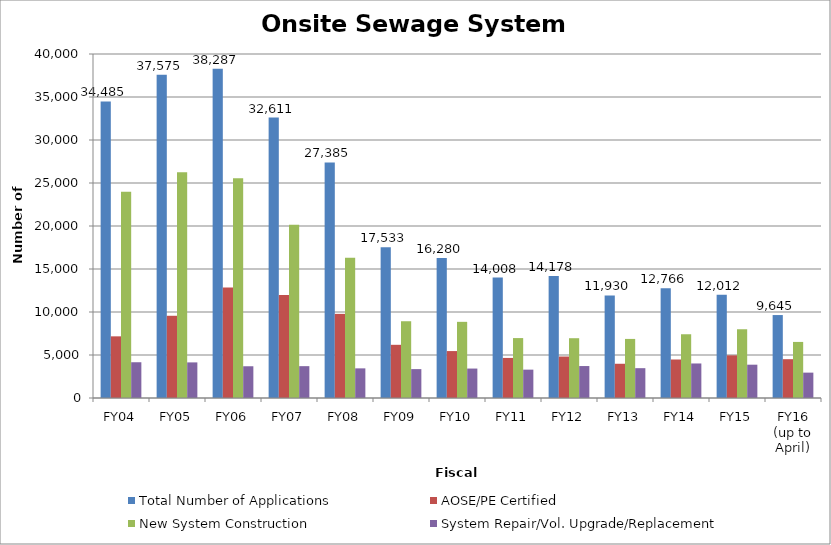
| Category | Total Number of Applications | AOSE/PE Certified | New System Construction | System Repair/Vol. Upgrade/Replacement |
|---|---|---|---|---|
| FY04 | 34485 | 7170 | 23980 | 4158 |
| FY05 | 37575 | 9561 | 26264 | 4140 |
| FY06 | 38287 | 12838 | 25538 | 3691 |
| FY07 | 32611 | 11972 | 20151 | 3703 |
| FY08 | 27385 | 9781 | 16308 | 3446 |
| FY09 | 17533 | 6185 | 8926 | 3359 |
| FY10 | 16280 | 5457 | 8856 | 3424 |
| FY11 | 14008 | 4659 | 6968 | 3297 |
| FY12 | 14178 | 4822 | 6953 | 3716 |
| FY13 | 11930 | 3981 | 6870 | 3468 |
| FY14 | 12766 | 4478 | 7413 | 4015 |
| FY15 | 12012 | 4961 | 7994 | 3873 |
| FY16 (up to April) | 9645 | 4513 | 6520 | 2950 |